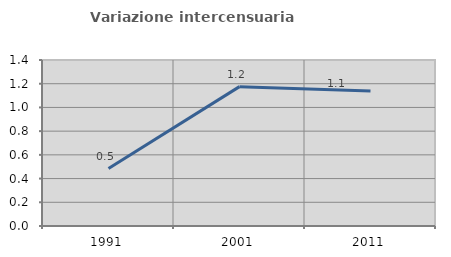
| Category | Variazione intercensuaria annua |
|---|---|
| 1991.0 | 0.484 |
| 2001.0 | 1.175 |
| 2011.0 | 1.139 |